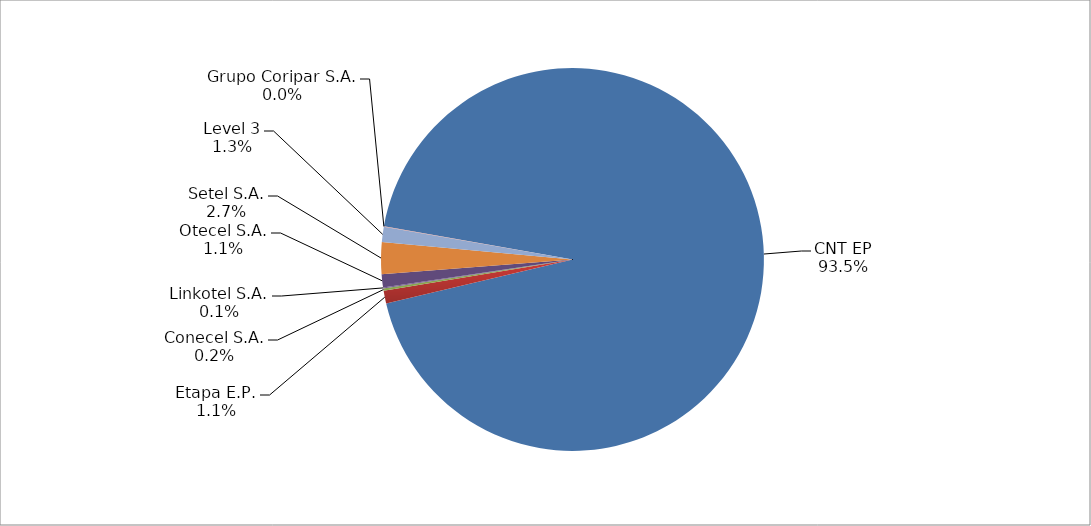
| Category | Series 0 |
|---|---|
| CNT EP | 2271 |
| Etapa E.P. | 26 |
| Conecel S.A. | 5 |
| Linkotel S.A. | 2 |
| Otecel S.A. | 27 |
| Setel S.A. | 65 |
| Level 3 | 31 |
| Grupo Coripar S.A. | 1 |